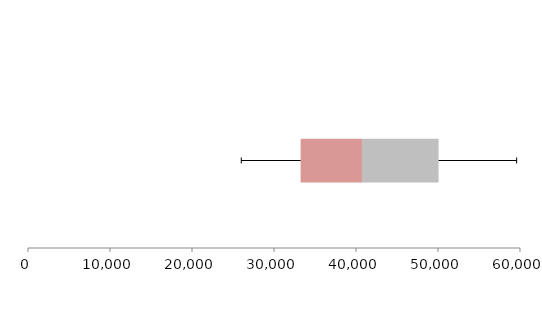
| Category | Series 1 | Series 2 | Series 3 |
|---|---|---|---|
| 0 | 33247.742 | 7477.419 | 9342.927 |